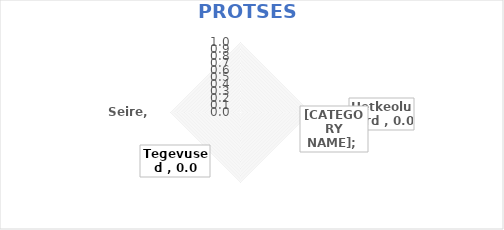
| Category | Series 0 |
|---|---|
| Hetkeolukord  | 0 |
| Eesmärgid  | 0 |
| Tegevused  | 0 |
| Seire | 0 |